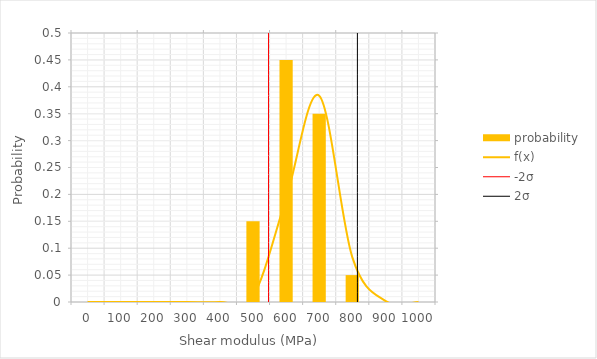
| Category | probability |
|---|---|
| 0.0 | 0 |
| 100.0 | 0 |
| 200.0 | 0 |
| 300.0 | 0 |
| 400.0 | 0 |
| 500.0 | 0.15 |
| 600.0 | 0.45 |
| 700.0 | 0.35 |
| 800.0 | 0.05 |
| 900.0 | 0 |
| 1000.0 | 0 |